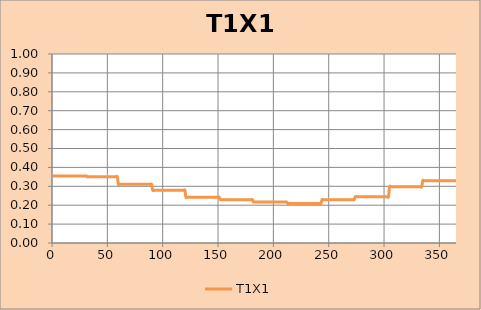
| Category | T1X1 |
|---|---|
| 1.0 | 0.355 |
| 2.0 | 0.355 |
| 3.0 | 0.355 |
| 4.0 | 0.355 |
| 5.0 | 0.355 |
| 6.0 | 0.355 |
| 7.0 | 0.355 |
| 8.0 | 0.355 |
| 9.0 | 0.355 |
| 10.0 | 0.355 |
| 11.0 | 0.355 |
| 12.0 | 0.355 |
| 13.0 | 0.355 |
| 14.0 | 0.355 |
| 15.0 | 0.355 |
| 16.0 | 0.355 |
| 17.0 | 0.355 |
| 18.0 | 0.355 |
| 19.0 | 0.355 |
| 20.0 | 0.355 |
| 21.0 | 0.355 |
| 22.0 | 0.355 |
| 23.0 | 0.355 |
| 24.0 | 0.355 |
| 25.0 | 0.355 |
| 26.0 | 0.355 |
| 27.0 | 0.355 |
| 28.0 | 0.355 |
| 29.0 | 0.355 |
| 30.0 | 0.355 |
| 31.0 | 0.355 |
| 32.0 | 0.35 |
| 33.0 | 0.35 |
| 34.0 | 0.35 |
| 35.0 | 0.35 |
| 36.0 | 0.35 |
| 37.0 | 0.35 |
| 38.0 | 0.35 |
| 39.0 | 0.35 |
| 40.0 | 0.35 |
| 41.0 | 0.35 |
| 42.0 | 0.35 |
| 43.0 | 0.35 |
| 44.0 | 0.35 |
| 45.0 | 0.35 |
| 46.0 | 0.35 |
| 47.0 | 0.35 |
| 48.0 | 0.35 |
| 49.0 | 0.35 |
| 50.0 | 0.35 |
| 51.0 | 0.35 |
| 52.0 | 0.35 |
| 53.0 | 0.35 |
| 54.0 | 0.35 |
| 55.0 | 0.35 |
| 56.0 | 0.35 |
| 57.0 | 0.35 |
| 58.0 | 0.35 |
| 59.0 | 0.35 |
| 60.0 | 0.31 |
| 61.0 | 0.31 |
| 62.0 | 0.31 |
| 63.0 | 0.31 |
| 64.0 | 0.31 |
| 65.0 | 0.31 |
| 66.0 | 0.31 |
| 67.0 | 0.31 |
| 68.0 | 0.31 |
| 69.0 | 0.31 |
| 70.0 | 0.31 |
| 71.0 | 0.31 |
| 72.0 | 0.31 |
| 73.0 | 0.31 |
| 74.0 | 0.31 |
| 75.0 | 0.31 |
| 76.0 | 0.31 |
| 77.0 | 0.31 |
| 78.0 | 0.31 |
| 79.0 | 0.31 |
| 80.0 | 0.31 |
| 81.0 | 0.31 |
| 82.0 | 0.31 |
| 83.0 | 0.31 |
| 84.0 | 0.31 |
| 85.0 | 0.31 |
| 86.0 | 0.31 |
| 87.0 | 0.31 |
| 88.0 | 0.31 |
| 89.0 | 0.31 |
| 90.0 | 0.31 |
| 91.0 | 0.279 |
| 92.0 | 0.279 |
| 93.0 | 0.279 |
| 94.0 | 0.279 |
| 95.0 | 0.279 |
| 96.0 | 0.279 |
| 97.0 | 0.279 |
| 98.0 | 0.279 |
| 99.0 | 0.279 |
| 100.0 | 0.279 |
| 101.0 | 0.279 |
| 102.0 | 0.279 |
| 103.0 | 0.279 |
| 104.0 | 0.279 |
| 105.0 | 0.279 |
| 106.0 | 0.279 |
| 107.0 | 0.279 |
| 108.0 | 0.279 |
| 109.0 | 0.279 |
| 110.0 | 0.279 |
| 111.0 | 0.279 |
| 112.0 | 0.279 |
| 113.0 | 0.279 |
| 114.0 | 0.279 |
| 115.0 | 0.279 |
| 116.0 | 0.279 |
| 117.0 | 0.279 |
| 118.0 | 0.279 |
| 119.0 | 0.279 |
| 120.0 | 0.279 |
| 121.0 | 0.242 |
| 122.0 | 0.242 |
| 123.0 | 0.242 |
| 124.0 | 0.242 |
| 125.0 | 0.242 |
| 126.0 | 0.242 |
| 127.0 | 0.242 |
| 128.0 | 0.242 |
| 129.0 | 0.242 |
| 130.0 | 0.242 |
| 131.0 | 0.242 |
| 132.0 | 0.242 |
| 133.0 | 0.242 |
| 134.0 | 0.242 |
| 135.0 | 0.242 |
| 136.0 | 0.242 |
| 137.0 | 0.242 |
| 138.0 | 0.242 |
| 139.0 | 0.242 |
| 140.0 | 0.242 |
| 141.0 | 0.242 |
| 142.0 | 0.242 |
| 143.0 | 0.242 |
| 144.0 | 0.242 |
| 145.0 | 0.242 |
| 146.0 | 0.242 |
| 147.0 | 0.242 |
| 148.0 | 0.242 |
| 149.0 | 0.242 |
| 150.0 | 0.242 |
| 151.0 | 0.242 |
| 152.0 | 0.229 |
| 153.0 | 0.229 |
| 154.0 | 0.229 |
| 155.0 | 0.229 |
| 156.0 | 0.229 |
| 157.0 | 0.229 |
| 158.0 | 0.229 |
| 159.0 | 0.229 |
| 160.0 | 0.229 |
| 161.0 | 0.229 |
| 162.0 | 0.229 |
| 163.0 | 0.229 |
| 164.0 | 0.229 |
| 165.0 | 0.229 |
| 166.0 | 0.229 |
| 167.0 | 0.229 |
| 168.0 | 0.229 |
| 169.0 | 0.229 |
| 170.0 | 0.229 |
| 171.0 | 0.229 |
| 172.0 | 0.229 |
| 173.0 | 0.229 |
| 174.0 | 0.229 |
| 175.0 | 0.229 |
| 176.0 | 0.229 |
| 177.0 | 0.229 |
| 178.0 | 0.229 |
| 179.0 | 0.229 |
| 180.0 | 0.229 |
| 181.0 | 0.229 |
| 182.0 | 0.217 |
| 183.0 | 0.217 |
| 184.0 | 0.217 |
| 185.0 | 0.217 |
| 186.0 | 0.217 |
| 187.0 | 0.217 |
| 188.0 | 0.217 |
| 189.0 | 0.217 |
| 190.0 | 0.217 |
| 191.0 | 0.217 |
| 192.0 | 0.217 |
| 193.0 | 0.217 |
| 194.0 | 0.217 |
| 195.0 | 0.217 |
| 196.0 | 0.217 |
| 197.0 | 0.217 |
| 198.0 | 0.217 |
| 199.0 | 0.217 |
| 200.0 | 0.217 |
| 201.0 | 0.217 |
| 202.0 | 0.217 |
| 203.0 | 0.217 |
| 204.0 | 0.217 |
| 205.0 | 0.217 |
| 206.0 | 0.217 |
| 207.0 | 0.217 |
| 208.0 | 0.217 |
| 209.0 | 0.217 |
| 210.0 | 0.217 |
| 211.0 | 0.217 |
| 212.0 | 0.217 |
| 213.0 | 0.209 |
| 214.0 | 0.209 |
| 215.0 | 0.209 |
| 216.0 | 0.209 |
| 217.0 | 0.209 |
| 218.0 | 0.209 |
| 219.0 | 0.209 |
| 220.0 | 0.209 |
| 221.0 | 0.209 |
| 222.0 | 0.209 |
| 223.0 | 0.209 |
| 224.0 | 0.209 |
| 225.0 | 0.209 |
| 226.0 | 0.209 |
| 227.0 | 0.209 |
| 228.0 | 0.209 |
| 229.0 | 0.209 |
| 230.0 | 0.209 |
| 231.0 | 0.209 |
| 232.0 | 0.209 |
| 233.0 | 0.209 |
| 234.0 | 0.209 |
| 235.0 | 0.209 |
| 236.0 | 0.209 |
| 237.0 | 0.209 |
| 238.0 | 0.209 |
| 239.0 | 0.209 |
| 240.0 | 0.209 |
| 241.0 | 0.209 |
| 242.0 | 0.209 |
| 243.0 | 0.209 |
| 244.0 | 0.229 |
| 245.0 | 0.229 |
| 246.0 | 0.229 |
| 247.0 | 0.229 |
| 248.0 | 0.229 |
| 249.0 | 0.229 |
| 250.0 | 0.229 |
| 251.0 | 0.229 |
| 252.0 | 0.229 |
| 253.0 | 0.229 |
| 254.0 | 0.229 |
| 255.0 | 0.229 |
| 256.0 | 0.229 |
| 257.0 | 0.229 |
| 258.0 | 0.229 |
| 259.0 | 0.229 |
| 260.0 | 0.229 |
| 261.0 | 0.229 |
| 262.0 | 0.229 |
| 263.0 | 0.229 |
| 264.0 | 0.229 |
| 265.0 | 0.229 |
| 266.0 | 0.229 |
| 267.0 | 0.229 |
| 268.0 | 0.229 |
| 269.0 | 0.229 |
| 270.0 | 0.229 |
| 271.0 | 0.229 |
| 272.0 | 0.229 |
| 273.0 | 0.229 |
| 274.0 | 0.245 |
| 275.0 | 0.245 |
| 276.0 | 0.245 |
| 277.0 | 0.245 |
| 278.0 | 0.245 |
| 279.0 | 0.245 |
| 280.0 | 0.245 |
| 281.0 | 0.245 |
| 282.0 | 0.245 |
| 283.0 | 0.245 |
| 284.0 | 0.245 |
| 285.0 | 0.245 |
| 286.0 | 0.245 |
| 287.0 | 0.245 |
| 288.0 | 0.245 |
| 289.0 | 0.245 |
| 290.0 | 0.245 |
| 291.0 | 0.245 |
| 292.0 | 0.245 |
| 293.0 | 0.245 |
| 294.0 | 0.245 |
| 295.0 | 0.245 |
| 296.0 | 0.245 |
| 297.0 | 0.245 |
| 298.0 | 0.245 |
| 299.0 | 0.245 |
| 300.0 | 0.245 |
| 301.0 | 0.245 |
| 302.0 | 0.245 |
| 303.0 | 0.245 |
| 304.0 | 0.245 |
| 305.0 | 0.298 |
| 306.0 | 0.298 |
| 307.0 | 0.298 |
| 308.0 | 0.298 |
| 309.0 | 0.298 |
| 310.0 | 0.298 |
| 311.0 | 0.298 |
| 312.0 | 0.298 |
| 313.0 | 0.298 |
| 314.0 | 0.298 |
| 315.0 | 0.298 |
| 316.0 | 0.298 |
| 317.0 | 0.298 |
| 318.0 | 0.298 |
| 319.0 | 0.298 |
| 320.0 | 0.298 |
| 321.0 | 0.298 |
| 322.0 | 0.298 |
| 323.0 | 0.298 |
| 324.0 | 0.298 |
| 325.0 | 0.298 |
| 326.0 | 0.298 |
| 327.0 | 0.298 |
| 328.0 | 0.298 |
| 329.0 | 0.298 |
| 330.0 | 0.298 |
| 331.0 | 0.298 |
| 332.0 | 0.298 |
| 333.0 | 0.298 |
| 334.0 | 0.298 |
| 335.0 | 0.33 |
| 336.0 | 0.33 |
| 337.0 | 0.33 |
| 338.0 | 0.33 |
| 339.0 | 0.33 |
| 340.0 | 0.33 |
| 341.0 | 0.33 |
| 342.0 | 0.33 |
| 343.0 | 0.33 |
| 344.0 | 0.33 |
| 345.0 | 0.33 |
| 346.0 | 0.33 |
| 347.0 | 0.33 |
| 348.0 | 0.33 |
| 349.0 | 0.33 |
| 350.0 | 0.33 |
| 351.0 | 0.33 |
| 352.0 | 0.33 |
| 353.0 | 0.33 |
| 354.0 | 0.33 |
| 355.0 | 0.33 |
| 356.0 | 0.33 |
| 357.0 | 0.33 |
| 358.0 | 0.33 |
| 359.0 | 0.33 |
| 360.0 | 0.33 |
| 361.0 | 0.33 |
| 362.0 | 0.33 |
| 363.0 | 0.33 |
| 364.0 | 0.33 |
| 365.0 | 0.33 |